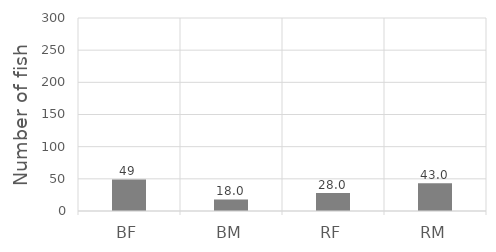
| Category | Series 0 |
|---|---|
| BF | 49 |
| BM | 18 |
| RF | 28 |
| RM | 43 |